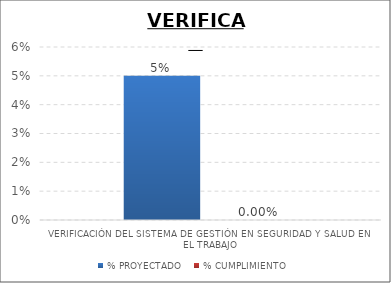
| Category | % PROYECTADO | % CUMPLIMIENTO |
|---|---|---|
| VERIFICACIÓN DEL SISTEMA DE GESTIÓN EN SEGURIDAD Y SALUD EN EL TRABAJO | 0.05 | 0 |